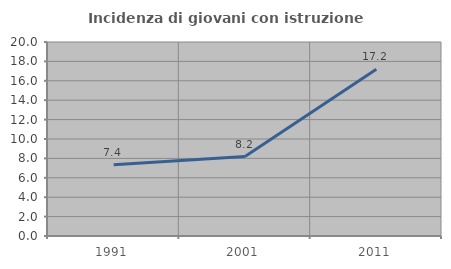
| Category | Incidenza di giovani con istruzione universitaria |
|---|---|
| 1991.0 | 7.356 |
| 2001.0 | 8.193 |
| 2011.0 | 17.185 |